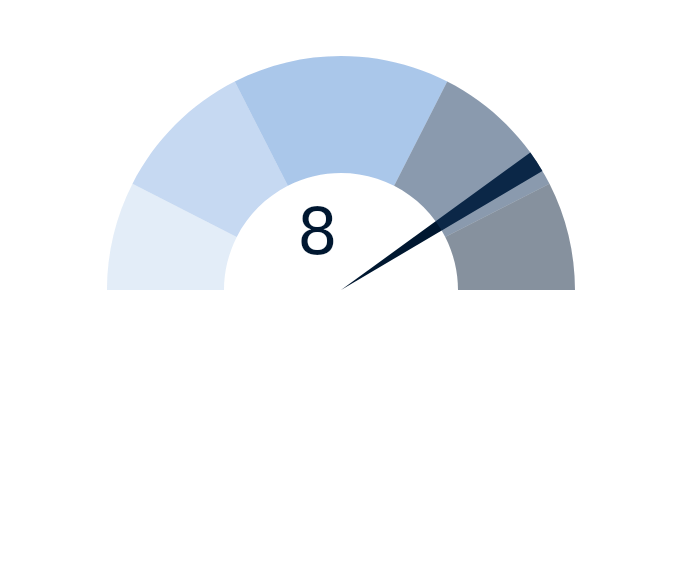
| Category | Series 2 |
|---|---|
| 0 | 8 |
| 1 | 0.3 |
| 2 | 11.7 |